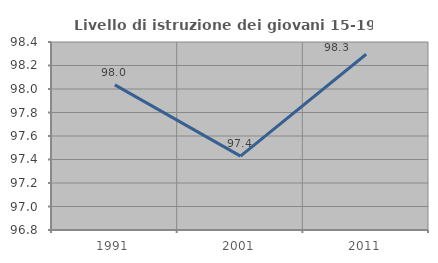
| Category | Livello di istruzione dei giovani 15-19 anni |
|---|---|
| 1991.0 | 98.035 |
| 2001.0 | 97.429 |
| 2011.0 | 98.295 |